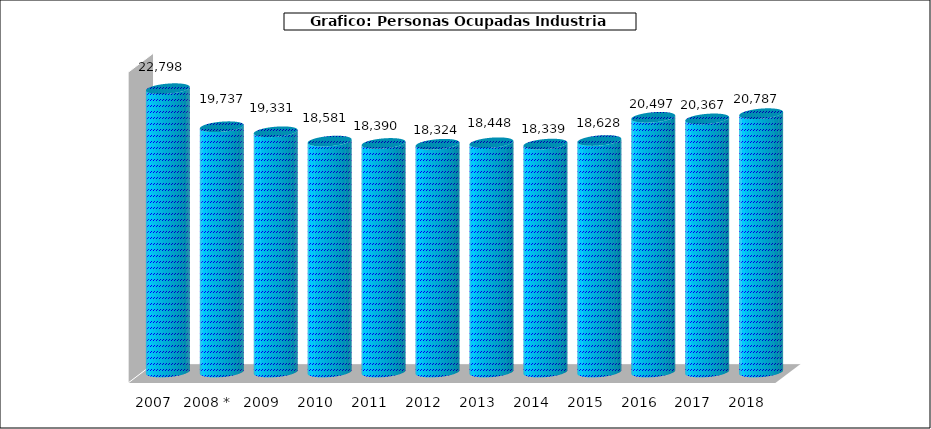
| Category |  Nº Personas Ocupadas Industria Pesquera |
|---|---|
| 2007 | 22798 |
| 2008 * | 19737 |
| 2009 | 19331 |
| 2010 | 18581 |
| 2011 | 18390 |
| 2012 | 18324 |
| 2013 | 18448 |
| 2014 | 18339 |
| 2015 | 18628 |
| 2016 | 20497 |
| 2017 | 20367 |
| 2018 | 20787 |